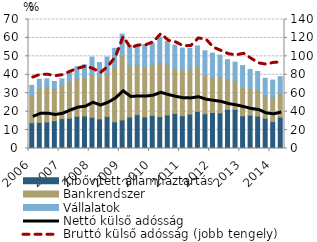
| Category | Kibővített államháztartás | Bankrendszer | Vállalatok |
|---|---|---|---|
| 2006.0 | 13.945 | 15.159 | 5.146 |
| 2006.0 | 14.142 | 18.706 | 4.728 |
| 2006.0 | 14.385 | 18.882 | 4.525 |
| 2006.0 | 15.105 | 17.538 | 3.743 |
| 2007.0 | 16.217 | 18.181 | 3.377 |
| 2007.0 | 16.513 | 19.693 | 5.108 |
| 2007.0 | 17.418 | 20.729 | 6.207 |
| 2007.0 | 17.65 | 20.753 | 7.021 |
| 2008.0 | 16.901 | 23.329 | 9.386 |
| 2008.0 | 16.097 | 22.645 | 7.881 |
| 2008.0 | 17.349 | 23.169 | 9.161 |
| 2008.0 | 14.512 | 29.804 | 10.051 |
| 2009.0 | 15.515 | 34.838 | 11.727 |
| 2009.0 | 17.091 | 27.641 | 11.215 |
| 2009.0 | 18.319 | 27.1 | 11.074 |
| 2009.0 | 17.087 | 27.246 | 12.043 |
| 2010.0 | 17.966 | 27.45 | 11.909 |
| 2010.0 | 17.28 | 29.509 | 13.657 |
| 2010.0 | 18.149 | 27.111 | 12.787 |
| 2010.0 | 18.984 | 24.232 | 12.866 |
| 2011.0 | 17.785 | 24.775 | 11.939 |
| 2011.0 | 18.634 | 24.456 | 11.285 |
| 2011.0 | 20.152 | 24.005 | 11.506 |
| 2011.0 | 18.841 | 20.797 | 13.375 |
| 2012.0 | 19.529 | 19.671 | 12.557 |
| 2012.0 | 19.286 | 19.684 | 11.669 |
| 2012.0 | 21.264 | 16.786 | 10.164 |
| 2012.0 | 21.211 | 15.231 | 10.407 |
| 2013.0 | 17.747 | 15.51 | 11.739 |
| 2013.0 | 18.091 | 14.021 | 10.801 |
| 2013.0 | 17.61 | 14.33 | 9.839 |
| 2013.0 | 16.354 | 12.119 | 9.648 |
| 2014.0 | 14.662 | 13.125 | 9.33 |
| 2014.0 | 17 | 12.992 | 9.001 |